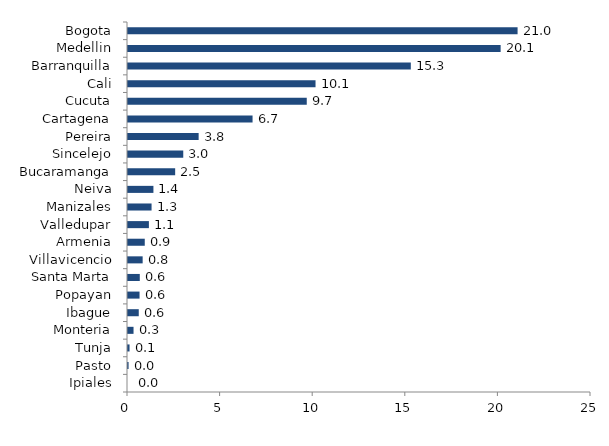
| Category | Series 0 |
|---|---|
| Ipiales | 0 |
| Pasto | 0.031 |
| Tunja | 0.084 |
| Monteria | 0.299 |
| Ibague | 0.581 |
| Popayan | 0.623 |
| Santa Marta | 0.636 |
| Villavicencio | 0.791 |
| Armenia | 0.905 |
| Valledupar | 1.128 |
| Manizales | 1.272 |
| Neiva | 1.373 |
| Bucaramanga | 2.547 |
| Sincelejo | 2.984 |
| Pereira | 3.814 |
| Cartagena | 6.726 |
| Cucuta | 9.652 |
| Cali | 10.126 |
| Barranquilla | 15.271 |
| Medellin | 20.121 |
| Bogota | 21.036 |